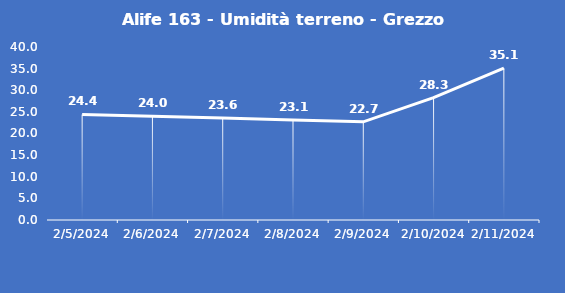
| Category | Alife 163 - Umidità terreno - Grezzo (%VWC) |
|---|---|
| 2/5/24 | 24.4 |
| 2/6/24 | 24 |
| 2/7/24 | 23.6 |
| 2/8/24 | 23.1 |
| 2/9/24 | 22.7 |
| 2/10/24 | 28.3 |
| 2/11/24 | 35.1 |